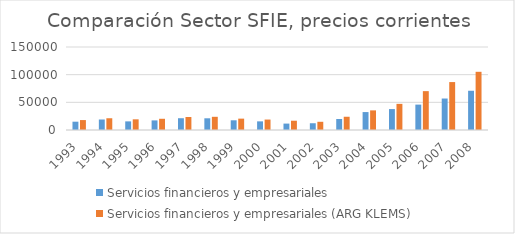
| Category | Servicios financieros y empresariales | Servicios financieros y empresariales (ARG KLEMS) |
|---|---|---|
| 1993.0 | 15018.704 | 17947.115 |
| 1994.0 | 18982.897 | 21239.001 |
| 1995.0 | 15585.465 | 19295.393 |
| 1996.0 | 17367.714 | 20269.951 |
| 1997.0 | 21282.769 | 23476.614 |
| 1998.0 | 21156.525 | 23845.973 |
| 1999.0 | 17544.176 | 20530.27 |
| 2000.0 | 15619.464 | 18874.947 |
| 2001.0 | 11582.01 | 16771.058 |
| 2002.0 | 12215.968 | 14846.943 |
| 2003.0 | 19934.166 | 23939.856 |
| 2004.0 | 32396.608 | 35468.861 |
| 2005.0 | 37821.573 | 47256.694 |
| 2006.0 | 45883.49 | 70235.556 |
| 2007.0 | 56882.202 | 86623.491 |
| 2008.0 | 70924.801 | 105176.498 |